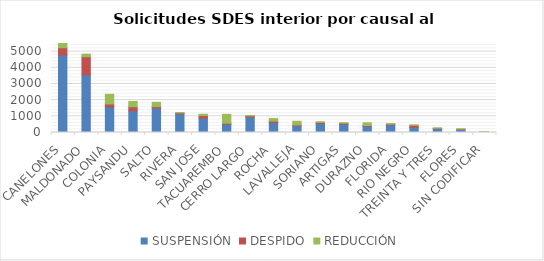
| Category | SUSPENSIÓN | DESPIDO | REDUCCIÓN |
|---|---|---|---|
| CANELONES | 4784 | 451 | 538 |
| MALDONADO | 3562 | 1120 | 161 |
| COLONIA | 1588 | 177 | 595 |
| PAYSANDU | 1335 | 257 | 330 |
| SALTO | 1513 | 85 | 269 |
| RIVERA | 1149 | 61 | 19 |
| SAN JOSE | 882 | 166 | 80 |
| TACUAREMBO | 513 | 58 | 550 |
| CERRO LARGO | 956 | 67 | 21 |
| ROCHA | 606 | 97 | 156 |
| LAVALLEJA | 416 | 50 | 229 |
| SORIANO | 565 | 60 | 35 |
| ARTIGAS | 518 | 56 | 25 |
| DURAZNO | 397 | 36 | 166 |
| FLORIDA | 474 | 43 | 28 |
| RIO NEGRO | 314 | 130 | 22 |
| TREINTA Y TRES | 240 | 26 | 9 |
| FLORES | 186 | 21 | 13 |
| SIN CODIFICAR | 43 | 3 | 9 |